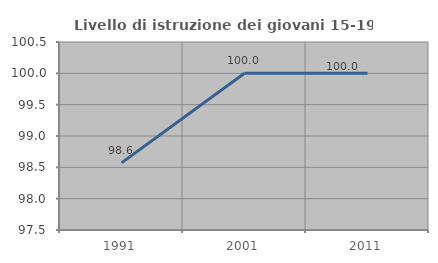
| Category | Livello di istruzione dei giovani 15-19 anni |
|---|---|
| 1991.0 | 98.571 |
| 2001.0 | 100 |
| 2011.0 | 100 |